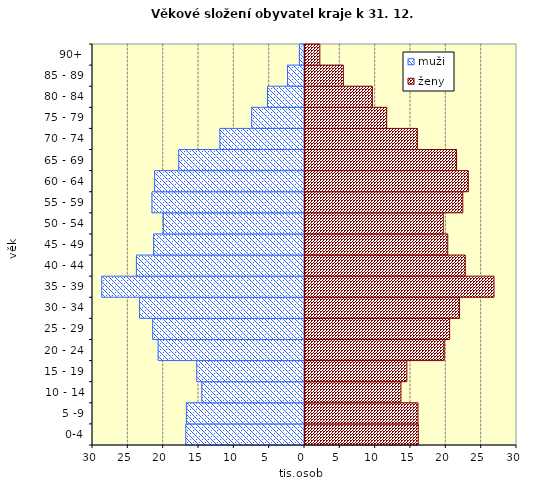
| Category | muži | ženy |
|---|---|---|
| 0-4 | -16798 | 16168 |
|  5 -9 | -16712 | 16129 |
|  10 - 14 | -14531 | 13716 |
| 15 - 19 | -15243 | 14557 |
| 20 - 24 | -20710 | 19838 |
| 25 - 29 | -21487 | 20610 |
| 30 - 34 | -23336 | 22017 |
| 35 - 39 | -28690 | 26887 |
| 40 - 44 | -23785 | 22819 |
| 45 - 49 | -21350 | 20342 |
| 50 - 54 | -19979 | 19705 |
| 55 - 59 | -21583 | 22472 |
| 60 - 64 | -21203 | 23250 |
| 65 - 69 | -17798 | 21595 |
| 70 - 74 | -11971 | 16041 |
| 75 - 79 | -7480 | 11703 |
| 80 - 84 | -5239 | 9678 |
| 85 - 89 | -2401 | 5571 |
| 90+ | -722 | 2240 |